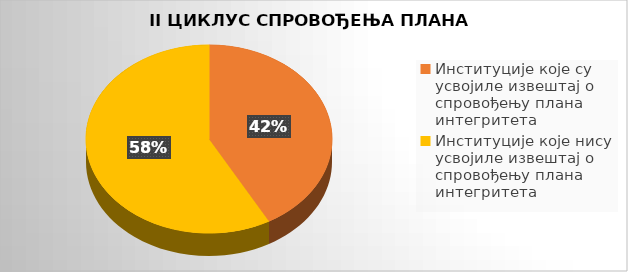
| Category | Series 0 |
|---|---|
| Институције које су усвојиле извештај о спровођењу плана интегритета | 0.419 |
| Институције које нису усвојиле извештај о спровођењу плана интегритета | 0.581 |